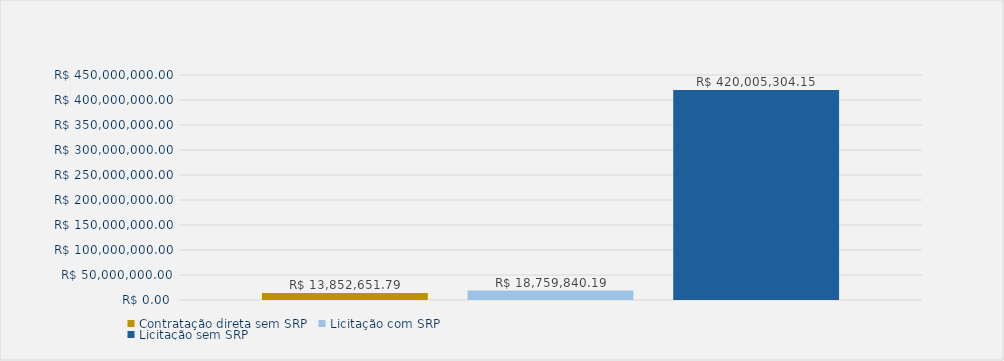
| Category | Contratação direta sem SRP | Licitação com SRP | Licitação sem SRP |
|---|---|---|---|
| Total | 13852651.79 | 18759840.19 | 420005304.15 |